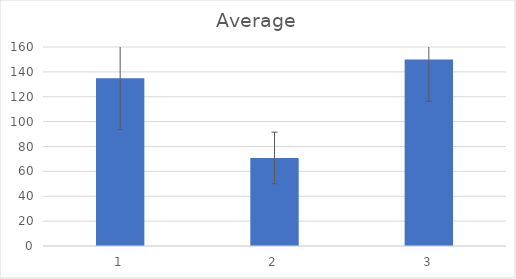
| Category | Average |
|---|---|
| 0 | 134.8 |
| 1 | 70.8 |
| 2 | 150 |